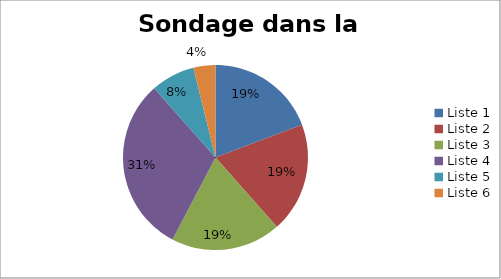
| Category | Series 0 |
|---|---|
| Liste 1 | 5 |
| Liste 2 | 5 |
| Liste 3 | 5 |
| Liste 4 | 8 |
| Liste 5 | 2 |
| Liste 6 | 1 |